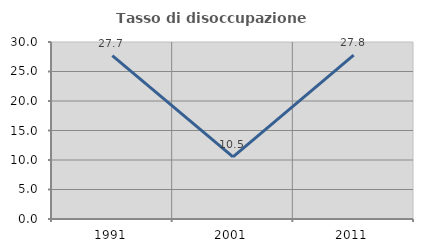
| Category | Tasso di disoccupazione giovanile  |
|---|---|
| 1991.0 | 27.692 |
| 2001.0 | 10.526 |
| 2011.0 | 27.778 |